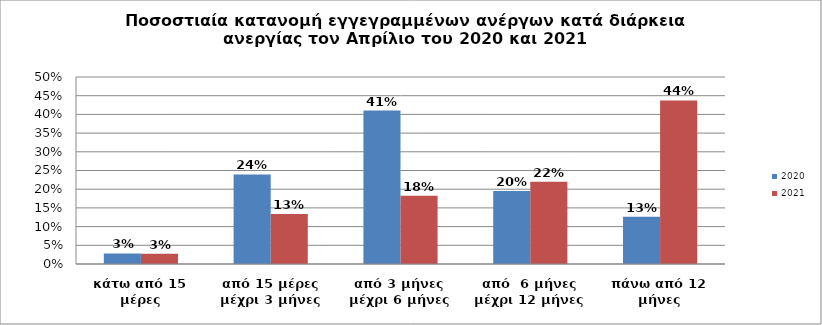
| Category | 2020 | 2021 |
|---|---|---|
| κάτω από 15 μέρες | 0.028 | 0.027 |
| από 15 μέρες μέχρι 3 μήνες | 0.24 | 0.134 |
| από 3 μήνες μέχρι 6 μήνες | 0.41 | 0.182 |
| από  6 μήνες μέχρι 12 μήνες | 0.195 | 0.22 |
| πάνω από 12 μήνες | 0.126 | 0.437 |